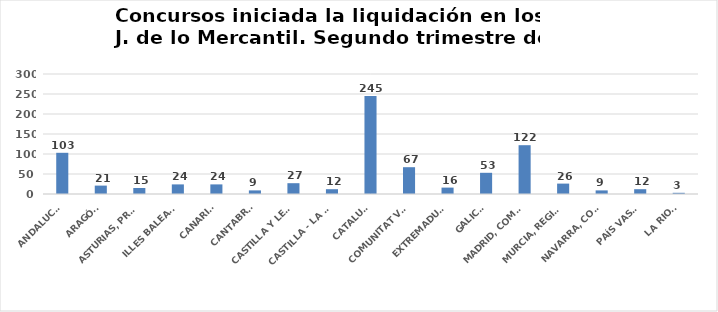
| Category | Series 0 |
|---|---|
| ANDALUCÍA | 103 |
| ARAGÓN | 21 |
| ASTURIAS, PRINCIPADO | 15 |
| ILLES BALEARS | 24 |
| CANARIAS | 24 |
| CANTABRIA | 9 |
| CASTILLA Y LEÓN | 27 |
| CASTILLA - LA MANCHA | 12 |
| CATALUÑA | 245 |
| COMUNITAT VALENCIANA | 67 |
| EXTREMADURA | 16 |
| GALICIA | 53 |
| MADRID, COMUNIDAD | 122 |
| MURCIA, REGIÓN | 26 |
| NAVARRA, COM. FORAL | 9 |
| PAÍS VASCO | 12 |
| LA RIOJA | 3 |